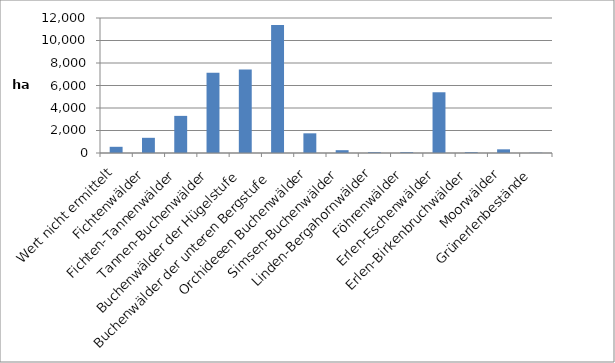
| Category | Series 0 |
|---|---|
| Wert nicht ermittelt | 551 |
| Fichtenwälder | 1350 |
| Fichten-Tannenwälder | 3300 |
| Tannen-Buchenwälder | 7131 |
| Buchenwälder der Hügelstufe | 7412 |
| Buchenwälder der unteren Bergstufe | 11388 |
| Orchideeen Buchenwälder | 1749 |
| Simsen-Buchenwälder | 250 |
| Linden-Bergahornwälder | 74 |
| Föhrenwälder | 75 |
| Erlen-Eschenwälder | 5398 |
| Erlen-Birkenbruchwälder | 75 |
| Moorwälder | 326 |
| Grünerlenbestände | 25 |